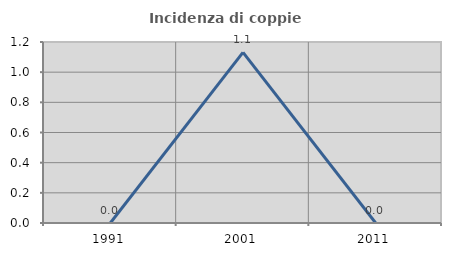
| Category | Incidenza di coppie miste |
|---|---|
| 1991.0 | 0 |
| 2001.0 | 1.131 |
| 2011.0 | 0 |